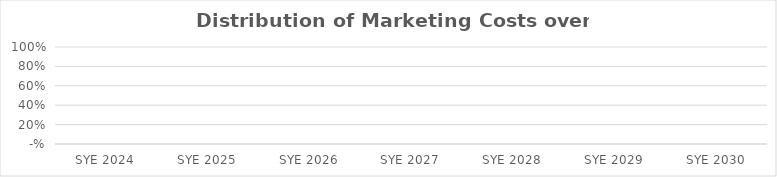
| Category | Series 0 |
|---|---|
| 2024.0 | 0 |
| 2025.0 | 0 |
| 2026.0 | 0 |
| 2027.0 | 0 |
| 2028.0 | 0 |
| 2029.0 | 0 |
| 2030.0 | 0 |